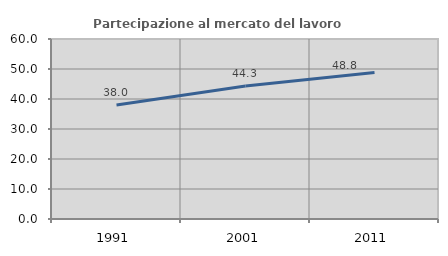
| Category | Partecipazione al mercato del lavoro  femminile |
|---|---|
| 1991.0 | 38.009 |
| 2001.0 | 44.331 |
| 2011.0 | 48.796 |